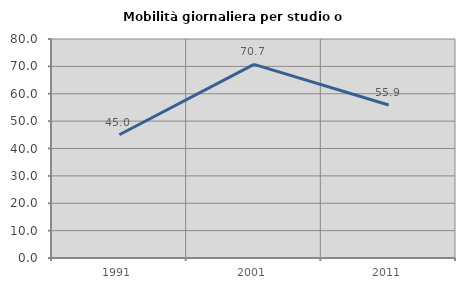
| Category | Mobilità giornaliera per studio o lavoro |
|---|---|
| 1991.0 | 45.015 |
| 2001.0 | 70.744 |
| 2011.0 | 55.908 |